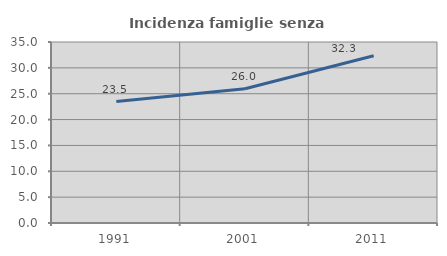
| Category | Incidenza famiglie senza nuclei |
|---|---|
| 1991.0 | 23.48 |
| 2001.0 | 25.962 |
| 2011.0 | 32.336 |